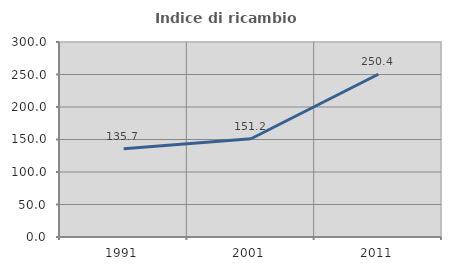
| Category | Indice di ricambio occupazionale  |
|---|---|
| 1991.0 | 135.714 |
| 2001.0 | 151.19 |
| 2011.0 | 250.4 |